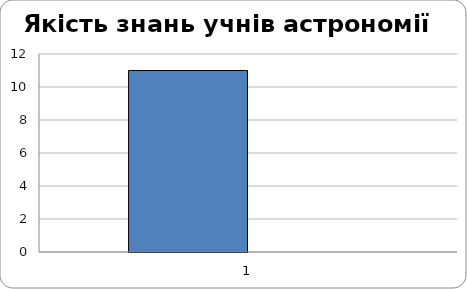
| Category | Series 0 | Series 1 |
|---|---|---|
| 0 | 11 | 0 |